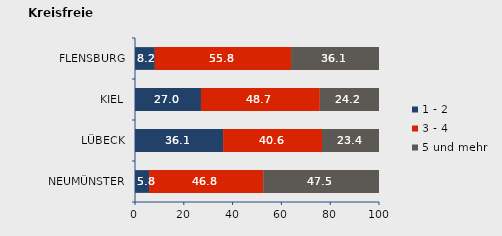
| Category | 1 - 2 | 3 - 4 | 5 und mehr |
|---|---|---|---|
| NEUMÜNSTER | 5.755 | 46.763 | 47.482 |
| LÜBECK | 36.093 | 40.552 | 23.355 |
| KIEL | 27.04 | 48.718 | 24.242 |
| FLENSBURG | 8.155 | 55.794 | 36.052 |